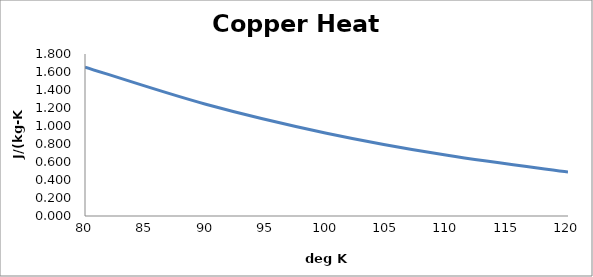
| Category | Series 0 |
|---|---|
| 80.0 | 1.655 |
| 90.0 | 1.242 |
| 100.0 | 0.92 |
| 110.0 | 0.674 |
| 120.0 | 0.488 |